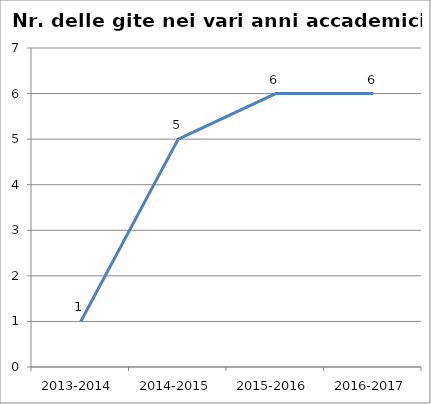
| Category | Nr. Gite Svolte |
|---|---|
| 2013-2014 | 1 |
| 2014-2015 | 5 |
| 2015-2016 | 6 |
| 2016-2017 | 6 |